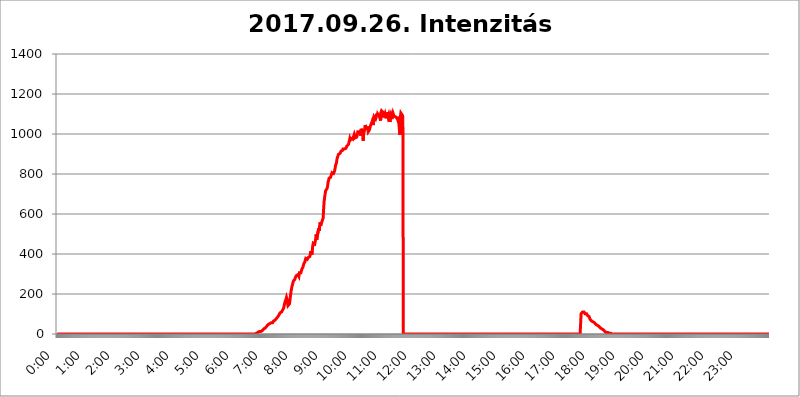
| Category | 2017.09.26. Intenzitás [W/m^2] |
|---|---|
| 0.0 | 0 |
| 0.0006944444444444445 | 0 |
| 0.001388888888888889 | 0 |
| 0.0020833333333333333 | 0 |
| 0.002777777777777778 | 0 |
| 0.003472222222222222 | 0 |
| 0.004166666666666667 | 0 |
| 0.004861111111111111 | 0 |
| 0.005555555555555556 | 0 |
| 0.0062499999999999995 | 0 |
| 0.006944444444444444 | 0 |
| 0.007638888888888889 | 0 |
| 0.008333333333333333 | 0 |
| 0.009027777777777779 | 0 |
| 0.009722222222222222 | 0 |
| 0.010416666666666666 | 0 |
| 0.011111111111111112 | 0 |
| 0.011805555555555555 | 0 |
| 0.012499999999999999 | 0 |
| 0.013194444444444444 | 0 |
| 0.013888888888888888 | 0 |
| 0.014583333333333332 | 0 |
| 0.015277777777777777 | 0 |
| 0.015972222222222224 | 0 |
| 0.016666666666666666 | 0 |
| 0.017361111111111112 | 0 |
| 0.018055555555555557 | 0 |
| 0.01875 | 0 |
| 0.019444444444444445 | 0 |
| 0.02013888888888889 | 0 |
| 0.020833333333333332 | 0 |
| 0.02152777777777778 | 0 |
| 0.022222222222222223 | 0 |
| 0.02291666666666667 | 0 |
| 0.02361111111111111 | 0 |
| 0.024305555555555556 | 0 |
| 0.024999999999999998 | 0 |
| 0.025694444444444447 | 0 |
| 0.02638888888888889 | 0 |
| 0.027083333333333334 | 0 |
| 0.027777777777777776 | 0 |
| 0.02847222222222222 | 0 |
| 0.029166666666666664 | 0 |
| 0.029861111111111113 | 0 |
| 0.030555555555555555 | 0 |
| 0.03125 | 0 |
| 0.03194444444444445 | 0 |
| 0.03263888888888889 | 0 |
| 0.03333333333333333 | 0 |
| 0.034027777777777775 | 0 |
| 0.034722222222222224 | 0 |
| 0.035416666666666666 | 0 |
| 0.036111111111111115 | 0 |
| 0.03680555555555556 | 0 |
| 0.0375 | 0 |
| 0.03819444444444444 | 0 |
| 0.03888888888888889 | 0 |
| 0.03958333333333333 | 0 |
| 0.04027777777777778 | 0 |
| 0.04097222222222222 | 0 |
| 0.041666666666666664 | 0 |
| 0.042361111111111106 | 0 |
| 0.04305555555555556 | 0 |
| 0.043750000000000004 | 0 |
| 0.044444444444444446 | 0 |
| 0.04513888888888889 | 0 |
| 0.04583333333333334 | 0 |
| 0.04652777777777778 | 0 |
| 0.04722222222222222 | 0 |
| 0.04791666666666666 | 0 |
| 0.04861111111111111 | 0 |
| 0.049305555555555554 | 0 |
| 0.049999999999999996 | 0 |
| 0.05069444444444445 | 0 |
| 0.051388888888888894 | 0 |
| 0.052083333333333336 | 0 |
| 0.05277777777777778 | 0 |
| 0.05347222222222222 | 0 |
| 0.05416666666666667 | 0 |
| 0.05486111111111111 | 0 |
| 0.05555555555555555 | 0 |
| 0.05625 | 0 |
| 0.05694444444444444 | 0 |
| 0.057638888888888885 | 0 |
| 0.05833333333333333 | 0 |
| 0.05902777777777778 | 0 |
| 0.059722222222222225 | 0 |
| 0.06041666666666667 | 0 |
| 0.061111111111111116 | 0 |
| 0.06180555555555556 | 0 |
| 0.0625 | 0 |
| 0.06319444444444444 | 0 |
| 0.06388888888888888 | 0 |
| 0.06458333333333334 | 0 |
| 0.06527777777777778 | 0 |
| 0.06597222222222222 | 0 |
| 0.06666666666666667 | 0 |
| 0.06736111111111111 | 0 |
| 0.06805555555555555 | 0 |
| 0.06874999999999999 | 0 |
| 0.06944444444444443 | 0 |
| 0.07013888888888889 | 0 |
| 0.07083333333333333 | 0 |
| 0.07152777777777779 | 0 |
| 0.07222222222222223 | 0 |
| 0.07291666666666667 | 0 |
| 0.07361111111111111 | 0 |
| 0.07430555555555556 | 0 |
| 0.075 | 0 |
| 0.07569444444444444 | 0 |
| 0.0763888888888889 | 0 |
| 0.07708333333333334 | 0 |
| 0.07777777777777778 | 0 |
| 0.07847222222222222 | 0 |
| 0.07916666666666666 | 0 |
| 0.0798611111111111 | 0 |
| 0.08055555555555556 | 0 |
| 0.08125 | 0 |
| 0.08194444444444444 | 0 |
| 0.08263888888888889 | 0 |
| 0.08333333333333333 | 0 |
| 0.08402777777777777 | 0 |
| 0.08472222222222221 | 0 |
| 0.08541666666666665 | 0 |
| 0.08611111111111112 | 0 |
| 0.08680555555555557 | 0 |
| 0.08750000000000001 | 0 |
| 0.08819444444444445 | 0 |
| 0.08888888888888889 | 0 |
| 0.08958333333333333 | 0 |
| 0.09027777777777778 | 0 |
| 0.09097222222222222 | 0 |
| 0.09166666666666667 | 0 |
| 0.09236111111111112 | 0 |
| 0.09305555555555556 | 0 |
| 0.09375 | 0 |
| 0.09444444444444444 | 0 |
| 0.09513888888888888 | 0 |
| 0.09583333333333333 | 0 |
| 0.09652777777777777 | 0 |
| 0.09722222222222222 | 0 |
| 0.09791666666666667 | 0 |
| 0.09861111111111111 | 0 |
| 0.09930555555555555 | 0 |
| 0.09999999999999999 | 0 |
| 0.10069444444444443 | 0 |
| 0.1013888888888889 | 0 |
| 0.10208333333333335 | 0 |
| 0.10277777777777779 | 0 |
| 0.10347222222222223 | 0 |
| 0.10416666666666667 | 0 |
| 0.10486111111111111 | 0 |
| 0.10555555555555556 | 0 |
| 0.10625 | 0 |
| 0.10694444444444444 | 0 |
| 0.1076388888888889 | 0 |
| 0.10833333333333334 | 0 |
| 0.10902777777777778 | 0 |
| 0.10972222222222222 | 0 |
| 0.1111111111111111 | 0 |
| 0.11180555555555556 | 0 |
| 0.11180555555555556 | 0 |
| 0.1125 | 0 |
| 0.11319444444444444 | 0 |
| 0.11388888888888889 | 0 |
| 0.11458333333333333 | 0 |
| 0.11527777777777777 | 0 |
| 0.11597222222222221 | 0 |
| 0.11666666666666665 | 0 |
| 0.1173611111111111 | 0 |
| 0.11805555555555557 | 0 |
| 0.11944444444444445 | 0 |
| 0.12013888888888889 | 0 |
| 0.12083333333333333 | 0 |
| 0.12152777777777778 | 0 |
| 0.12222222222222223 | 0 |
| 0.12291666666666667 | 0 |
| 0.12291666666666667 | 0 |
| 0.12361111111111112 | 0 |
| 0.12430555555555556 | 0 |
| 0.125 | 0 |
| 0.12569444444444444 | 0 |
| 0.12638888888888888 | 0 |
| 0.12708333333333333 | 0 |
| 0.16875 | 0 |
| 0.12847222222222224 | 0 |
| 0.12916666666666668 | 0 |
| 0.12986111111111112 | 0 |
| 0.13055555555555556 | 0 |
| 0.13125 | 0 |
| 0.13194444444444445 | 0 |
| 0.1326388888888889 | 0 |
| 0.13333333333333333 | 0 |
| 0.13402777777777777 | 0 |
| 0.13402777777777777 | 0 |
| 0.13472222222222222 | 0 |
| 0.13541666666666666 | 0 |
| 0.1361111111111111 | 0 |
| 0.13749999999999998 | 0 |
| 0.13819444444444443 | 0 |
| 0.1388888888888889 | 0 |
| 0.13958333333333334 | 0 |
| 0.14027777777777778 | 0 |
| 0.14097222222222222 | 0 |
| 0.14166666666666666 | 0 |
| 0.1423611111111111 | 0 |
| 0.14305555555555557 | 0 |
| 0.14375000000000002 | 0 |
| 0.14444444444444446 | 0 |
| 0.1451388888888889 | 0 |
| 0.1451388888888889 | 0 |
| 0.14652777777777778 | 0 |
| 0.14722222222222223 | 0 |
| 0.14791666666666667 | 0 |
| 0.1486111111111111 | 0 |
| 0.14930555555555555 | 0 |
| 0.15 | 0 |
| 0.15069444444444444 | 0 |
| 0.15138888888888888 | 0 |
| 0.15208333333333332 | 0 |
| 0.15277777777777776 | 0 |
| 0.15347222222222223 | 0 |
| 0.15416666666666667 | 0 |
| 0.15486111111111112 | 0 |
| 0.15555555555555556 | 0 |
| 0.15625 | 0 |
| 0.15694444444444444 | 0 |
| 0.15763888888888888 | 0 |
| 0.15833333333333333 | 0 |
| 0.15902777777777777 | 0 |
| 0.15972222222222224 | 0 |
| 0.16041666666666668 | 0 |
| 0.16111111111111112 | 0 |
| 0.16180555555555556 | 0 |
| 0.1625 | 0 |
| 0.16319444444444445 | 0 |
| 0.1638888888888889 | 0 |
| 0.16458333333333333 | 0 |
| 0.16527777777777777 | 0 |
| 0.16597222222222222 | 0 |
| 0.16666666666666666 | 0 |
| 0.1673611111111111 | 0 |
| 0.16805555555555554 | 0 |
| 0.16874999999999998 | 0 |
| 0.16944444444444443 | 0 |
| 0.17013888888888887 | 0 |
| 0.1708333333333333 | 0 |
| 0.17152777777777775 | 0 |
| 0.17222222222222225 | 0 |
| 0.1729166666666667 | 0 |
| 0.17361111111111113 | 0 |
| 0.17430555555555557 | 0 |
| 0.17500000000000002 | 0 |
| 0.17569444444444446 | 0 |
| 0.1763888888888889 | 0 |
| 0.17708333333333334 | 0 |
| 0.17777777777777778 | 0 |
| 0.17847222222222223 | 0 |
| 0.17916666666666667 | 0 |
| 0.1798611111111111 | 0 |
| 0.18055555555555555 | 0 |
| 0.18125 | 0 |
| 0.18194444444444444 | 0 |
| 0.1826388888888889 | 0 |
| 0.18333333333333335 | 0 |
| 0.1840277777777778 | 0 |
| 0.18472222222222223 | 0 |
| 0.18541666666666667 | 0 |
| 0.18611111111111112 | 0 |
| 0.18680555555555556 | 0 |
| 0.1875 | 0 |
| 0.18819444444444444 | 0 |
| 0.18888888888888888 | 0 |
| 0.18958333333333333 | 0 |
| 0.19027777777777777 | 0 |
| 0.1909722222222222 | 0 |
| 0.19166666666666665 | 0 |
| 0.19236111111111112 | 0 |
| 0.19305555555555554 | 0 |
| 0.19375 | 0 |
| 0.19444444444444445 | 0 |
| 0.1951388888888889 | 0 |
| 0.19583333333333333 | 0 |
| 0.19652777777777777 | 0 |
| 0.19722222222222222 | 0 |
| 0.19791666666666666 | 0 |
| 0.1986111111111111 | 0 |
| 0.19930555555555554 | 0 |
| 0.19999999999999998 | 0 |
| 0.20069444444444443 | 0 |
| 0.20138888888888887 | 0 |
| 0.2020833333333333 | 0 |
| 0.2027777777777778 | 0 |
| 0.2034722222222222 | 0 |
| 0.2041666666666667 | 0 |
| 0.20486111111111113 | 0 |
| 0.20555555555555557 | 0 |
| 0.20625000000000002 | 0 |
| 0.20694444444444446 | 0 |
| 0.2076388888888889 | 0 |
| 0.20833333333333334 | 0 |
| 0.20902777777777778 | 0 |
| 0.20972222222222223 | 0 |
| 0.21041666666666667 | 0 |
| 0.2111111111111111 | 0 |
| 0.21180555555555555 | 0 |
| 0.2125 | 0 |
| 0.21319444444444444 | 0 |
| 0.2138888888888889 | 0 |
| 0.21458333333333335 | 0 |
| 0.2152777777777778 | 0 |
| 0.21597222222222223 | 0 |
| 0.21666666666666667 | 0 |
| 0.21736111111111112 | 0 |
| 0.21805555555555556 | 0 |
| 0.21875 | 0 |
| 0.21944444444444444 | 0 |
| 0.22013888888888888 | 0 |
| 0.22083333333333333 | 0 |
| 0.22152777777777777 | 0 |
| 0.2222222222222222 | 0 |
| 0.22291666666666665 | 0 |
| 0.2236111111111111 | 0 |
| 0.22430555555555556 | 0 |
| 0.225 | 0 |
| 0.22569444444444445 | 0 |
| 0.2263888888888889 | 0 |
| 0.22708333333333333 | 0 |
| 0.22777777777777777 | 0 |
| 0.22847222222222222 | 0 |
| 0.22916666666666666 | 0 |
| 0.2298611111111111 | 0 |
| 0.23055555555555554 | 0 |
| 0.23124999999999998 | 0 |
| 0.23194444444444443 | 0 |
| 0.23263888888888887 | 0 |
| 0.2333333333333333 | 0 |
| 0.2340277777777778 | 0 |
| 0.2347222222222222 | 0 |
| 0.2354166666666667 | 0 |
| 0.23611111111111113 | 0 |
| 0.23680555555555557 | 0 |
| 0.23750000000000002 | 0 |
| 0.23819444444444446 | 0 |
| 0.2388888888888889 | 0 |
| 0.23958333333333334 | 0 |
| 0.24027777777777778 | 0 |
| 0.24097222222222223 | 0 |
| 0.24166666666666667 | 0 |
| 0.2423611111111111 | 0 |
| 0.24305555555555555 | 0 |
| 0.24375 | 0 |
| 0.24444444444444446 | 0 |
| 0.24513888888888888 | 0 |
| 0.24583333333333335 | 0 |
| 0.2465277777777778 | 0 |
| 0.24722222222222223 | 0 |
| 0.24791666666666667 | 0 |
| 0.24861111111111112 | 0 |
| 0.24930555555555556 | 0 |
| 0.25 | 0 |
| 0.25069444444444444 | 0 |
| 0.2513888888888889 | 0 |
| 0.2520833333333333 | 0 |
| 0.25277777777777777 | 0 |
| 0.2534722222222222 | 0 |
| 0.25416666666666665 | 0 |
| 0.2548611111111111 | 0 |
| 0.2555555555555556 | 0 |
| 0.25625000000000003 | 0 |
| 0.2569444444444445 | 0 |
| 0.2576388888888889 | 0 |
| 0.25833333333333336 | 0 |
| 0.2590277777777778 | 0 |
| 0.25972222222222224 | 0 |
| 0.2604166666666667 | 0 |
| 0.2611111111111111 | 0 |
| 0.26180555555555557 | 0 |
| 0.2625 | 0 |
| 0.26319444444444445 | 0 |
| 0.2638888888888889 | 0 |
| 0.26458333333333334 | 0 |
| 0.2652777777777778 | 0 |
| 0.2659722222222222 | 0 |
| 0.26666666666666666 | 0 |
| 0.2673611111111111 | 0 |
| 0.26805555555555555 | 0 |
| 0.26875 | 0 |
| 0.26944444444444443 | 0 |
| 0.2701388888888889 | 0 |
| 0.2708333333333333 | 0 |
| 0.27152777777777776 | 0 |
| 0.2722222222222222 | 0 |
| 0.27291666666666664 | 0 |
| 0.2736111111111111 | 0 |
| 0.2743055555555555 | 0 |
| 0.27499999999999997 | 0 |
| 0.27569444444444446 | 3.525 |
| 0.27638888888888885 | 0 |
| 0.27708333333333335 | 0 |
| 0.2777777777777778 | 3.525 |
| 0.27847222222222223 | 3.525 |
| 0.2791666666666667 | 3.525 |
| 0.2798611111111111 | 3.525 |
| 0.28055555555555556 | 7.887 |
| 0.28125 | 7.887 |
| 0.28194444444444444 | 7.887 |
| 0.2826388888888889 | 7.887 |
| 0.2833333333333333 | 12.257 |
| 0.28402777777777777 | 12.257 |
| 0.2847222222222222 | 12.257 |
| 0.28541666666666665 | 12.257 |
| 0.28611111111111115 | 16.636 |
| 0.28680555555555554 | 16.636 |
| 0.28750000000000003 | 16.636 |
| 0.2881944444444445 | 21.024 |
| 0.2888888888888889 | 21.024 |
| 0.28958333333333336 | 25.419 |
| 0.2902777777777778 | 25.419 |
| 0.29097222222222224 | 29.823 |
| 0.2916666666666667 | 29.823 |
| 0.2923611111111111 | 34.234 |
| 0.29305555555555557 | 34.234 |
| 0.29375 | 38.653 |
| 0.29444444444444445 | 38.653 |
| 0.2951388888888889 | 43.079 |
| 0.29583333333333334 | 47.511 |
| 0.2965277777777778 | 47.511 |
| 0.2972222222222222 | 51.951 |
| 0.29791666666666666 | 51.951 |
| 0.2986111111111111 | 51.951 |
| 0.29930555555555555 | 51.951 |
| 0.3 | 56.398 |
| 0.30069444444444443 | 56.398 |
| 0.3013888888888889 | 56.398 |
| 0.3020833333333333 | 56.398 |
| 0.30277777777777776 | 60.85 |
| 0.3034722222222222 | 65.31 |
| 0.30416666666666664 | 65.31 |
| 0.3048611111111111 | 65.31 |
| 0.3055555555555555 | 69.775 |
| 0.30624999999999997 | 74.246 |
| 0.3069444444444444 | 74.246 |
| 0.3076388888888889 | 78.722 |
| 0.30833333333333335 | 83.205 |
| 0.3090277777777778 | 83.205 |
| 0.30972222222222223 | 87.692 |
| 0.3104166666666667 | 92.184 |
| 0.3111111111111111 | 96.682 |
| 0.31180555555555556 | 101.184 |
| 0.3125 | 105.69 |
| 0.31319444444444444 | 105.69 |
| 0.3138888888888889 | 110.201 |
| 0.3145833333333333 | 110.201 |
| 0.31527777777777777 | 114.716 |
| 0.3159722222222222 | 119.235 |
| 0.31666666666666665 | 123.758 |
| 0.31736111111111115 | 128.284 |
| 0.31805555555555554 | 137.347 |
| 0.31875000000000003 | 150.964 |
| 0.3194444444444445 | 160.056 |
| 0.3201388888888889 | 164.605 |
| 0.32083333333333336 | 173.709 |
| 0.3215277777777778 | 182.82 |
| 0.32222222222222224 | 173.709 |
| 0.3229166666666667 | 155.509 |
| 0.3236111111111111 | 141.884 |
| 0.32430555555555557 | 137.347 |
| 0.325 | 141.884 |
| 0.32569444444444445 | 150.964 |
| 0.3263888888888889 | 169.156 |
| 0.32708333333333334 | 191.937 |
| 0.3277777777777778 | 210.182 |
| 0.3284722222222222 | 223.873 |
| 0.32916666666666666 | 237.564 |
| 0.3298611111111111 | 246.689 |
| 0.33055555555555555 | 255.813 |
| 0.33125 | 264.932 |
| 0.33194444444444443 | 260.373 |
| 0.3326388888888889 | 269.49 |
| 0.3333333333333333 | 274.047 |
| 0.3340277777777778 | 283.156 |
| 0.3347222222222222 | 287.709 |
| 0.3354166666666667 | 292.259 |
| 0.3361111111111111 | 292.259 |
| 0.3368055555555556 | 296.808 |
| 0.33749999999999997 | 296.808 |
| 0.33819444444444446 | 296.808 |
| 0.33888888888888885 | 287.709 |
| 0.33958333333333335 | 305.898 |
| 0.34027777777777773 | 305.898 |
| 0.34097222222222223 | 310.44 |
| 0.3416666666666666 | 305.898 |
| 0.3423611111111111 | 314.98 |
| 0.3430555555555555 | 324.052 |
| 0.34375 | 328.584 |
| 0.3444444444444445 | 333.113 |
| 0.3451388888888889 | 342.162 |
| 0.3458333333333334 | 351.198 |
| 0.34652777777777777 | 355.712 |
| 0.34722222222222227 | 360.221 |
| 0.34791666666666665 | 364.728 |
| 0.34861111111111115 | 378.224 |
| 0.34930555555555554 | 382.715 |
| 0.35000000000000003 | 378.224 |
| 0.3506944444444444 | 373.729 |
| 0.3513888888888889 | 373.729 |
| 0.3520833333333333 | 382.715 |
| 0.3527777777777778 | 378.224 |
| 0.3534722222222222 | 382.715 |
| 0.3541666666666667 | 387.202 |
| 0.3548611111111111 | 396.164 |
| 0.35555555555555557 | 414.035 |
| 0.35625 | 405.108 |
| 0.35694444444444445 | 396.164 |
| 0.3576388888888889 | 414.035 |
| 0.35833333333333334 | 440.702 |
| 0.3590277777777778 | 453.968 |
| 0.3597222222222222 | 458.38 |
| 0.36041666666666666 | 453.968 |
| 0.3611111111111111 | 449.551 |
| 0.36180555555555555 | 453.968 |
| 0.3625 | 475.972 |
| 0.36319444444444443 | 497.836 |
| 0.3638888888888889 | 471.582 |
| 0.3645833333333333 | 467.187 |
| 0.3652777777777778 | 475.972 |
| 0.3659722222222222 | 515.223 |
| 0.3666666666666667 | 528.2 |
| 0.3673611111111111 | 515.223 |
| 0.3680555555555556 | 541.121 |
| 0.36874999999999997 | 558.261 |
| 0.36944444444444446 | 541.121 |
| 0.37013888888888885 | 549.704 |
| 0.37083333333333335 | 558.261 |
| 0.37152777777777773 | 558.261 |
| 0.37222222222222223 | 558.261 |
| 0.3729166666666666 | 579.542 |
| 0.3736111111111111 | 625.784 |
| 0.3743055555555555 | 663.019 |
| 0.375 | 683.473 |
| 0.3756944444444445 | 699.717 |
| 0.3763888888888889 | 715.858 |
| 0.3770833333333334 | 711.832 |
| 0.37777777777777777 | 719.877 |
| 0.37847222222222227 | 727.896 |
| 0.37916666666666665 | 739.877 |
| 0.37986111111111115 | 759.723 |
| 0.38055555555555554 | 767.62 |
| 0.38125000000000003 | 779.42 |
| 0.3819444444444444 | 783.342 |
| 0.3826388888888889 | 783.342 |
| 0.3833333333333333 | 783.342 |
| 0.3840277777777778 | 791.169 |
| 0.3847222222222222 | 795.074 |
| 0.3854166666666667 | 806.757 |
| 0.3861111111111111 | 810.641 |
| 0.38680555555555557 | 806.757 |
| 0.3875 | 802.868 |
| 0.38819444444444445 | 802.868 |
| 0.3888888888888889 | 814.519 |
| 0.38958333333333334 | 826.123 |
| 0.3902777777777778 | 841.526 |
| 0.3909722222222222 | 845.365 |
| 0.39166666666666666 | 856.855 |
| 0.3923611111111111 | 875.918 |
| 0.39305555555555555 | 883.516 |
| 0.39375 | 887.309 |
| 0.39444444444444443 | 898.668 |
| 0.3951388888888889 | 902.447 |
| 0.3958333333333333 | 898.668 |
| 0.3965277777777778 | 902.447 |
| 0.3972222222222222 | 906.223 |
| 0.3979166666666667 | 913.766 |
| 0.3986111111111111 | 917.534 |
| 0.3993055555555556 | 917.534 |
| 0.39999999999999997 | 917.534 |
| 0.40069444444444446 | 925.06 |
| 0.40138888888888885 | 925.06 |
| 0.40208333333333335 | 925.06 |
| 0.40277777777777773 | 925.06 |
| 0.40347222222222223 | 921.298 |
| 0.4041666666666666 | 925.06 |
| 0.4048611111111111 | 928.819 |
| 0.4055555555555555 | 928.819 |
| 0.40625 | 940.082 |
| 0.4069444444444445 | 936.33 |
| 0.4076388888888889 | 943.832 |
| 0.4083333333333334 | 947.58 |
| 0.40902777777777777 | 951.327 |
| 0.40972222222222227 | 966.295 |
| 0.41041666666666665 | 977.508 |
| 0.41111111111111115 | 970.034 |
| 0.41180555555555554 | 970.034 |
| 0.41250000000000003 | 977.508 |
| 0.4131944444444444 | 977.508 |
| 0.4138888888888889 | 977.508 |
| 0.4145833333333333 | 973.772 |
| 0.4152777777777778 | 984.98 |
| 0.4159722222222222 | 988.714 |
| 0.4166666666666667 | 999.916 |
| 0.4173611111111111 | 992.448 |
| 0.41805555555555557 | 981.244 |
| 0.41875 | 977.508 |
| 0.41944444444444445 | 977.508 |
| 0.4201388888888889 | 984.98 |
| 0.42083333333333334 | 996.182 |
| 0.4215277777777778 | 1011.118 |
| 0.4222222222222222 | 1014.852 |
| 0.42291666666666666 | 1007.383 |
| 0.4236111111111111 | 1011.118 |
| 0.42430555555555555 | 999.916 |
| 0.425 | 1011.118 |
| 0.42569444444444443 | 992.448 |
| 0.4263888888888889 | 1026.06 |
| 0.4270833333333333 | 1018.587 |
| 0.4277777777777778 | 1003.65 |
| 0.4284722222222222 | 996.182 |
| 0.4291666666666667 | 966.295 |
| 0.4298611111111111 | 1022.323 |
| 0.4305555555555556 | 1014.852 |
| 0.43124999999999997 | 1026.06 |
| 0.43194444444444446 | 1044.762 |
| 0.43263888888888885 | 1037.277 |
| 0.43333333333333335 | 1037.277 |
| 0.43402777777777773 | 1022.323 |
| 0.43472222222222223 | 1037.277 |
| 0.4354166666666666 | 1026.06 |
| 0.4361111111111111 | 1011.118 |
| 0.4368055555555555 | 1011.118 |
| 0.4375 | 1018.587 |
| 0.4381944444444445 | 1026.06 |
| 0.4388888888888889 | 1029.798 |
| 0.4395833333333334 | 1044.762 |
| 0.44027777777777777 | 1041.019 |
| 0.44097222222222227 | 1056.004 |
| 0.44166666666666665 | 1063.51 |
| 0.44236111111111115 | 1052.255 |
| 0.44305555555555554 | 1044.762 |
| 0.44375000000000003 | 1067.267 |
| 0.4444444444444444 | 1086.097 |
| 0.4451388888888889 | 1089.873 |
| 0.4458333333333333 | 1089.873 |
| 0.4465277777777778 | 1074.789 |
| 0.4472222222222222 | 1082.324 |
| 0.4479166666666667 | 1101.226 |
| 0.4486111111111111 | 1089.873 |
| 0.44930555555555557 | 1101.226 |
| 0.45 | 1097.437 |
| 0.45069444444444445 | 1101.226 |
| 0.4513888888888889 | 1089.873 |
| 0.45208333333333334 | 1097.437 |
| 0.4527777777777778 | 1101.226 |
| 0.4534722222222222 | 1067.267 |
| 0.45416666666666666 | 1108.816 |
| 0.4548611111111111 | 1116.426 |
| 0.45555555555555555 | 1112.618 |
| 0.45625 | 1112.618 |
| 0.45694444444444443 | 1108.816 |
| 0.4576388888888889 | 1108.816 |
| 0.4583333333333333 | 1082.324 |
| 0.4590277777777778 | 1093.653 |
| 0.4597222222222222 | 1101.226 |
| 0.4604166666666667 | 1097.437 |
| 0.4611111111111111 | 1078.555 |
| 0.4618055555555556 | 1097.437 |
| 0.46249999999999997 | 1108.816 |
| 0.46319444444444446 | 1108.816 |
| 0.46388888888888885 | 1086.097 |
| 0.46458333333333335 | 1093.653 |
| 0.46527777777777773 | 1101.226 |
| 0.46597222222222223 | 1093.653 |
| 0.4666666666666666 | 1059.756 |
| 0.4673611111111111 | 1093.653 |
| 0.4680555555555555 | 1101.226 |
| 0.46875 | 1093.653 |
| 0.4694444444444445 | 1074.789 |
| 0.4701388888888889 | 1093.653 |
| 0.4708333333333334 | 1105.019 |
| 0.47152777777777777 | 1097.437 |
| 0.47222222222222227 | 1089.873 |
| 0.47291666666666665 | 1089.873 |
| 0.47361111111111115 | 1093.653 |
| 0.47430555555555554 | 1086.097 |
| 0.47500000000000003 | 1089.873 |
| 0.4756944444444444 | 1082.324 |
| 0.4763888888888889 | 1078.555 |
| 0.4770833333333333 | 1086.097 |
| 0.4777777777777778 | 1071.027 |
| 0.4784722222222222 | 1059.756 |
| 0.4791666666666667 | 1052.255 |
| 0.4798611111111111 | 1022.323 |
| 0.48055555555555557 | 996.182 |
| 0.48125 | 1086.097 |
| 0.48194444444444445 | 1105.019 |
| 0.4826388888888889 | 1101.226 |
| 0.48333333333333334 | 1101.226 |
| 0.4840277777777778 | 1093.653 |
| 0.4847222222222222 | 1086.097 |
| 0.48541666666666666 | 0 |
| 0.4861111111111111 | 0 |
| 0.48680555555555555 | 0 |
| 0.4875 | 0 |
| 0.48819444444444443 | 0 |
| 0.4888888888888889 | 0 |
| 0.4895833333333333 | 0 |
| 0.4902777777777778 | 0 |
| 0.4909722222222222 | 0 |
| 0.4916666666666667 | 0 |
| 0.4923611111111111 | 0 |
| 0.4930555555555556 | 0 |
| 0.49374999999999997 | 0 |
| 0.49444444444444446 | 0 |
| 0.49513888888888885 | 0 |
| 0.49583333333333335 | 0 |
| 0.49652777777777773 | 0 |
| 0.49722222222222223 | 0 |
| 0.4979166666666666 | 0 |
| 0.4986111111111111 | 0 |
| 0.4993055555555555 | 0 |
| 0.5 | 0 |
| 0.5006944444444444 | 0 |
| 0.5013888888888889 | 0 |
| 0.5020833333333333 | 0 |
| 0.5027777777777778 | 0 |
| 0.5034722222222222 | 0 |
| 0.5041666666666667 | 0 |
| 0.5048611111111111 | 0 |
| 0.5055555555555555 | 0 |
| 0.50625 | 0 |
| 0.5069444444444444 | 0 |
| 0.5076388888888889 | 0 |
| 0.5083333333333333 | 0 |
| 0.5090277777777777 | 0 |
| 0.5097222222222222 | 0 |
| 0.5104166666666666 | 0 |
| 0.5111111111111112 | 0 |
| 0.5118055555555555 | 0 |
| 0.5125000000000001 | 0 |
| 0.5131944444444444 | 0 |
| 0.513888888888889 | 0 |
| 0.5145833333333333 | 0 |
| 0.5152777777777778 | 0 |
| 0.5159722222222222 | 0 |
| 0.5166666666666667 | 0 |
| 0.517361111111111 | 0 |
| 0.5180555555555556 | 0 |
| 0.5187499999999999 | 0 |
| 0.5194444444444445 | 0 |
| 0.5201388888888888 | 0 |
| 0.5208333333333334 | 0 |
| 0.5215277777777778 | 0 |
| 0.5222222222222223 | 0 |
| 0.5229166666666667 | 0 |
| 0.5236111111111111 | 0 |
| 0.5243055555555556 | 0 |
| 0.525 | 0 |
| 0.5256944444444445 | 0 |
| 0.5263888888888889 | 0 |
| 0.5270833333333333 | 0 |
| 0.5277777777777778 | 0 |
| 0.5284722222222222 | 0 |
| 0.5291666666666667 | 0 |
| 0.5298611111111111 | 0 |
| 0.5305555555555556 | 0 |
| 0.53125 | 0 |
| 0.5319444444444444 | 0 |
| 0.5326388888888889 | 0 |
| 0.5333333333333333 | 0 |
| 0.5340277777777778 | 0 |
| 0.5347222222222222 | 0 |
| 0.5354166666666667 | 0 |
| 0.5361111111111111 | 0 |
| 0.5368055555555555 | 0 |
| 0.5375 | 0 |
| 0.5381944444444444 | 0 |
| 0.5388888888888889 | 0 |
| 0.5395833333333333 | 0 |
| 0.5402777777777777 | 0 |
| 0.5409722222222222 | 0 |
| 0.5416666666666666 | 0 |
| 0.5423611111111112 | 0 |
| 0.5430555555555555 | 0 |
| 0.5437500000000001 | 0 |
| 0.5444444444444444 | 0 |
| 0.545138888888889 | 0 |
| 0.5458333333333333 | 0 |
| 0.5465277777777778 | 0 |
| 0.5472222222222222 | 0 |
| 0.5479166666666667 | 0 |
| 0.548611111111111 | 0 |
| 0.5493055555555556 | 0 |
| 0.5499999999999999 | 0 |
| 0.5506944444444445 | 0 |
| 0.5513888888888888 | 0 |
| 0.5520833333333334 | 0 |
| 0.5527777777777778 | 0 |
| 0.5534722222222223 | 0 |
| 0.5541666666666667 | 0 |
| 0.5548611111111111 | 0 |
| 0.5555555555555556 | 0 |
| 0.55625 | 0 |
| 0.5569444444444445 | 0 |
| 0.5576388888888889 | 0 |
| 0.5583333333333333 | 0 |
| 0.5590277777777778 | 0 |
| 0.5597222222222222 | 0 |
| 0.5604166666666667 | 0 |
| 0.5611111111111111 | 0 |
| 0.5618055555555556 | 0 |
| 0.5625 | 0 |
| 0.5631944444444444 | 0 |
| 0.5638888888888889 | 0 |
| 0.5645833333333333 | 0 |
| 0.5652777777777778 | 0 |
| 0.5659722222222222 | 0 |
| 0.5666666666666667 | 0 |
| 0.5673611111111111 | 0 |
| 0.5680555555555555 | 0 |
| 0.56875 | 0 |
| 0.5694444444444444 | 0 |
| 0.5701388888888889 | 0 |
| 0.5708333333333333 | 0 |
| 0.5715277777777777 | 0 |
| 0.5722222222222222 | 0 |
| 0.5729166666666666 | 0 |
| 0.5736111111111112 | 0 |
| 0.5743055555555555 | 0 |
| 0.5750000000000001 | 0 |
| 0.5756944444444444 | 0 |
| 0.576388888888889 | 0 |
| 0.5770833333333333 | 0 |
| 0.5777777777777778 | 0 |
| 0.5784722222222222 | 0 |
| 0.5791666666666667 | 0 |
| 0.579861111111111 | 0 |
| 0.5805555555555556 | 0 |
| 0.5812499999999999 | 0 |
| 0.5819444444444445 | 0 |
| 0.5826388888888888 | 0 |
| 0.5833333333333334 | 0 |
| 0.5840277777777778 | 0 |
| 0.5847222222222223 | 0 |
| 0.5854166666666667 | 0 |
| 0.5861111111111111 | 0 |
| 0.5868055555555556 | 0 |
| 0.5875 | 0 |
| 0.5881944444444445 | 0 |
| 0.5888888888888889 | 0 |
| 0.5895833333333333 | 0 |
| 0.5902777777777778 | 0 |
| 0.5909722222222222 | 0 |
| 0.5916666666666667 | 0 |
| 0.5923611111111111 | 0 |
| 0.5930555555555556 | 0 |
| 0.59375 | 0 |
| 0.5944444444444444 | 0 |
| 0.5951388888888889 | 0 |
| 0.5958333333333333 | 0 |
| 0.5965277777777778 | 0 |
| 0.5972222222222222 | 0 |
| 0.5979166666666667 | 0 |
| 0.5986111111111111 | 0 |
| 0.5993055555555555 | 0 |
| 0.6 | 0 |
| 0.6006944444444444 | 0 |
| 0.6013888888888889 | 0 |
| 0.6020833333333333 | 0 |
| 0.6027777777777777 | 0 |
| 0.6034722222222222 | 0 |
| 0.6041666666666666 | 0 |
| 0.6048611111111112 | 0 |
| 0.6055555555555555 | 0 |
| 0.6062500000000001 | 0 |
| 0.6069444444444444 | 0 |
| 0.607638888888889 | 0 |
| 0.6083333333333333 | 0 |
| 0.6090277777777778 | 0 |
| 0.6097222222222222 | 0 |
| 0.6104166666666667 | 0 |
| 0.611111111111111 | 0 |
| 0.6118055555555556 | 0 |
| 0.6124999999999999 | 0 |
| 0.6131944444444445 | 0 |
| 0.6138888888888888 | 0 |
| 0.6145833333333334 | 0 |
| 0.6152777777777778 | 0 |
| 0.6159722222222223 | 0 |
| 0.6166666666666667 | 0 |
| 0.6173611111111111 | 0 |
| 0.6180555555555556 | 0 |
| 0.61875 | 0 |
| 0.6194444444444445 | 0 |
| 0.6201388888888889 | 0 |
| 0.6208333333333333 | 0 |
| 0.6215277777777778 | 0 |
| 0.6222222222222222 | 0 |
| 0.6229166666666667 | 0 |
| 0.6236111111111111 | 0 |
| 0.6243055555555556 | 0 |
| 0.625 | 0 |
| 0.6256944444444444 | 0 |
| 0.6263888888888889 | 0 |
| 0.6270833333333333 | 0 |
| 0.6277777777777778 | 0 |
| 0.6284722222222222 | 0 |
| 0.6291666666666667 | 0 |
| 0.6298611111111111 | 0 |
| 0.6305555555555555 | 0 |
| 0.63125 | 0 |
| 0.6319444444444444 | 0 |
| 0.6326388888888889 | 0 |
| 0.6333333333333333 | 0 |
| 0.6340277777777777 | 0 |
| 0.6347222222222222 | 0 |
| 0.6354166666666666 | 0 |
| 0.6361111111111112 | 0 |
| 0.6368055555555555 | 0 |
| 0.6375000000000001 | 0 |
| 0.6381944444444444 | 0 |
| 0.638888888888889 | 0 |
| 0.6395833333333333 | 0 |
| 0.6402777777777778 | 0 |
| 0.6409722222222222 | 0 |
| 0.6416666666666667 | 0 |
| 0.642361111111111 | 0 |
| 0.6430555555555556 | 0 |
| 0.6437499999999999 | 0 |
| 0.6444444444444445 | 0 |
| 0.6451388888888888 | 0 |
| 0.6458333333333334 | 0 |
| 0.6465277777777778 | 0 |
| 0.6472222222222223 | 0 |
| 0.6479166666666667 | 0 |
| 0.6486111111111111 | 0 |
| 0.6493055555555556 | 0 |
| 0.65 | 0 |
| 0.6506944444444445 | 0 |
| 0.6513888888888889 | 0 |
| 0.6520833333333333 | 0 |
| 0.6527777777777778 | 0 |
| 0.6534722222222222 | 0 |
| 0.6541666666666667 | 0 |
| 0.6548611111111111 | 0 |
| 0.6555555555555556 | 0 |
| 0.65625 | 0 |
| 0.6569444444444444 | 0 |
| 0.6576388888888889 | 0 |
| 0.6583333333333333 | 0 |
| 0.6590277777777778 | 0 |
| 0.6597222222222222 | 0 |
| 0.6604166666666667 | 0 |
| 0.6611111111111111 | 0 |
| 0.6618055555555555 | 0 |
| 0.6625 | 0 |
| 0.6631944444444444 | 0 |
| 0.6638888888888889 | 0 |
| 0.6645833333333333 | 0 |
| 0.6652777777777777 | 0 |
| 0.6659722222222222 | 0 |
| 0.6666666666666666 | 0 |
| 0.6673611111111111 | 0 |
| 0.6680555555555556 | 0 |
| 0.6687500000000001 | 0 |
| 0.6694444444444444 | 0 |
| 0.6701388888888888 | 0 |
| 0.6708333333333334 | 0 |
| 0.6715277777777778 | 0 |
| 0.6722222222222222 | 0 |
| 0.6729166666666666 | 0 |
| 0.6736111111111112 | 0 |
| 0.6743055555555556 | 0 |
| 0.6749999999999999 | 0 |
| 0.6756944444444444 | 0 |
| 0.6763888888888889 | 0 |
| 0.6770833333333334 | 0 |
| 0.6777777777777777 | 0 |
| 0.6784722222222223 | 0 |
| 0.6791666666666667 | 0 |
| 0.6798611111111111 | 0 |
| 0.6805555555555555 | 0 |
| 0.68125 | 0 |
| 0.6819444444444445 | 0 |
| 0.6826388888888889 | 0 |
| 0.6833333333333332 | 0 |
| 0.6840277777777778 | 0 |
| 0.6847222222222222 | 0 |
| 0.6854166666666667 | 0 |
| 0.686111111111111 | 0 |
| 0.6868055555555556 | 0 |
| 0.6875 | 0 |
| 0.6881944444444444 | 0 |
| 0.688888888888889 | 0 |
| 0.6895833333333333 | 0 |
| 0.6902777777777778 | 0 |
| 0.6909722222222222 | 0 |
| 0.6916666666666668 | 0 |
| 0.6923611111111111 | 0 |
| 0.6930555555555555 | 0 |
| 0.69375 | 0 |
| 0.6944444444444445 | 0 |
| 0.6951388888888889 | 0 |
| 0.6958333333333333 | 0 |
| 0.6965277777777777 | 0 |
| 0.6972222222222223 | 0 |
| 0.6979166666666666 | 0 |
| 0.6986111111111111 | 0 |
| 0.6993055555555556 | 0 |
| 0.7000000000000001 | 0 |
| 0.7006944444444444 | 0 |
| 0.7013888888888888 | 0 |
| 0.7020833333333334 | 0 |
| 0.7027777777777778 | 0 |
| 0.7034722222222222 | 0 |
| 0.7041666666666666 | 0 |
| 0.7048611111111112 | 0 |
| 0.7055555555555556 | 0 |
| 0.7062499999999999 | 0 |
| 0.7069444444444444 | 0 |
| 0.7076388888888889 | 0 |
| 0.7083333333333334 | 0 |
| 0.7090277777777777 | 0 |
| 0.7097222222222223 | 0 |
| 0.7104166666666667 | 0 |
| 0.7111111111111111 | 0 |
| 0.7118055555555555 | 0 |
| 0.7125 | 0 |
| 0.7131944444444445 | 0 |
| 0.7138888888888889 | 0 |
| 0.7145833333333332 | 0 |
| 0.7152777777777778 | 0 |
| 0.7159722222222222 | 0 |
| 0.7166666666666667 | 0 |
| 0.717361111111111 | 0 |
| 0.7180555555555556 | 0 |
| 0.71875 | 0 |
| 0.7194444444444444 | 0 |
| 0.720138888888889 | 0 |
| 0.7208333333333333 | 0 |
| 0.7215277777777778 | 0 |
| 0.7222222222222222 | 0 |
| 0.7229166666666668 | 0 |
| 0.7236111111111111 | 0 |
| 0.7243055555555555 | 0 |
| 0.725 | 0 |
| 0.7256944444444445 | 0 |
| 0.7263888888888889 | 0 |
| 0.7270833333333333 | 0 |
| 0.7277777777777777 | 0 |
| 0.7284722222222223 | 0 |
| 0.7291666666666666 | 0 |
| 0.7298611111111111 | 0 |
| 0.7305555555555556 | 0 |
| 0.7312500000000001 | 0 |
| 0.7319444444444444 | 0 |
| 0.7326388888888888 | 0 |
| 0.7333333333333334 | 0 |
| 0.7340277777777778 | 0 |
| 0.7347222222222222 | 101.184 |
| 0.7354166666666666 | 101.184 |
| 0.7361111111111112 | 105.69 |
| 0.7368055555555556 | 110.201 |
| 0.7374999999999999 | 110.201 |
| 0.7381944444444444 | 110.201 |
| 0.7388888888888889 | 110.201 |
| 0.7395833333333334 | 105.69 |
| 0.7402777777777777 | 101.184 |
| 0.7409722222222223 | 105.69 |
| 0.7416666666666667 | 101.184 |
| 0.7423611111111111 | 101.184 |
| 0.7430555555555555 | 96.682 |
| 0.74375 | 92.184 |
| 0.7444444444444445 | 87.692 |
| 0.7451388888888889 | 87.692 |
| 0.7458333333333332 | 87.692 |
| 0.7465277777777778 | 83.205 |
| 0.7472222222222222 | 74.246 |
| 0.7479166666666667 | 74.246 |
| 0.748611111111111 | 69.775 |
| 0.7493055555555556 | 65.31 |
| 0.75 | 65.31 |
| 0.7506944444444444 | 65.31 |
| 0.751388888888889 | 60.85 |
| 0.7520833333333333 | 60.85 |
| 0.7527777777777778 | 60.85 |
| 0.7534722222222222 | 56.398 |
| 0.7541666666666668 | 56.398 |
| 0.7548611111111111 | 51.951 |
| 0.7555555555555555 | 47.511 |
| 0.75625 | 47.511 |
| 0.7569444444444445 | 43.079 |
| 0.7576388888888889 | 43.079 |
| 0.7583333333333333 | 38.653 |
| 0.7590277777777777 | 38.653 |
| 0.7597222222222223 | 38.653 |
| 0.7604166666666666 | 34.234 |
| 0.7611111111111111 | 34.234 |
| 0.7618055555555556 | 29.823 |
| 0.7625000000000001 | 29.823 |
| 0.7631944444444444 | 25.419 |
| 0.7638888888888888 | 25.419 |
| 0.7645833333333334 | 21.024 |
| 0.7652777777777778 | 21.024 |
| 0.7659722222222222 | 21.024 |
| 0.7666666666666666 | 16.636 |
| 0.7673611111111112 | 16.636 |
| 0.7680555555555556 | 12.257 |
| 0.7687499999999999 | 12.257 |
| 0.7694444444444444 | 12.257 |
| 0.7701388888888889 | 7.887 |
| 0.7708333333333334 | 7.887 |
| 0.7715277777777777 | 7.887 |
| 0.7722222222222223 | 7.887 |
| 0.7729166666666667 | 3.525 |
| 0.7736111111111111 | 3.525 |
| 0.7743055555555555 | 3.525 |
| 0.775 | 3.525 |
| 0.7756944444444445 | 3.525 |
| 0.7763888888888889 | 3.525 |
| 0.7770833333333332 | 3.525 |
| 0.7777777777777778 | 0 |
| 0.7784722222222222 | 0 |
| 0.7791666666666667 | 0 |
| 0.779861111111111 | 0 |
| 0.7805555555555556 | 0 |
| 0.78125 | 0 |
| 0.7819444444444444 | 0 |
| 0.782638888888889 | 0 |
| 0.7833333333333333 | 0 |
| 0.7840277777777778 | 0 |
| 0.7847222222222222 | 0 |
| 0.7854166666666668 | 0 |
| 0.7861111111111111 | 0 |
| 0.7868055555555555 | 0 |
| 0.7875 | 0 |
| 0.7881944444444445 | 0 |
| 0.7888888888888889 | 0 |
| 0.7895833333333333 | 0 |
| 0.7902777777777777 | 0 |
| 0.7909722222222223 | 0 |
| 0.7916666666666666 | 0 |
| 0.7923611111111111 | 0 |
| 0.7930555555555556 | 0 |
| 0.7937500000000001 | 0 |
| 0.7944444444444444 | 0 |
| 0.7951388888888888 | 0 |
| 0.7958333333333334 | 0 |
| 0.7965277777777778 | 0 |
| 0.7972222222222222 | 0 |
| 0.7979166666666666 | 0 |
| 0.7986111111111112 | 0 |
| 0.7993055555555556 | 0 |
| 0.7999999999999999 | 0 |
| 0.8006944444444444 | 0 |
| 0.8013888888888889 | 0 |
| 0.8020833333333334 | 0 |
| 0.8027777777777777 | 0 |
| 0.8034722222222223 | 0 |
| 0.8041666666666667 | 0 |
| 0.8048611111111111 | 0 |
| 0.8055555555555555 | 0 |
| 0.80625 | 0 |
| 0.8069444444444445 | 0 |
| 0.8076388888888889 | 0 |
| 0.8083333333333332 | 0 |
| 0.8090277777777778 | 0 |
| 0.8097222222222222 | 0 |
| 0.8104166666666667 | 0 |
| 0.811111111111111 | 0 |
| 0.8118055555555556 | 0 |
| 0.8125 | 0 |
| 0.8131944444444444 | 0 |
| 0.813888888888889 | 0 |
| 0.8145833333333333 | 0 |
| 0.8152777777777778 | 0 |
| 0.8159722222222222 | 0 |
| 0.8166666666666668 | 0 |
| 0.8173611111111111 | 0 |
| 0.8180555555555555 | 0 |
| 0.81875 | 0 |
| 0.8194444444444445 | 0 |
| 0.8201388888888889 | 0 |
| 0.8208333333333333 | 0 |
| 0.8215277777777777 | 0 |
| 0.8222222222222223 | 0 |
| 0.8229166666666666 | 0 |
| 0.8236111111111111 | 0 |
| 0.8243055555555556 | 0 |
| 0.8250000000000001 | 0 |
| 0.8256944444444444 | 0 |
| 0.8263888888888888 | 0 |
| 0.8270833333333334 | 0 |
| 0.8277777777777778 | 0 |
| 0.8284722222222222 | 0 |
| 0.8291666666666666 | 0 |
| 0.8298611111111112 | 0 |
| 0.8305555555555556 | 0 |
| 0.8312499999999999 | 0 |
| 0.8319444444444444 | 0 |
| 0.8326388888888889 | 0 |
| 0.8333333333333334 | 0 |
| 0.8340277777777777 | 0 |
| 0.8347222222222223 | 0 |
| 0.8354166666666667 | 0 |
| 0.8361111111111111 | 0 |
| 0.8368055555555555 | 0 |
| 0.8375 | 0 |
| 0.8381944444444445 | 0 |
| 0.8388888888888889 | 0 |
| 0.8395833333333332 | 0 |
| 0.8402777777777778 | 0 |
| 0.8409722222222222 | 0 |
| 0.8416666666666667 | 0 |
| 0.842361111111111 | 0 |
| 0.8430555555555556 | 0 |
| 0.84375 | 0 |
| 0.8444444444444444 | 0 |
| 0.845138888888889 | 0 |
| 0.8458333333333333 | 0 |
| 0.8465277777777778 | 0 |
| 0.8472222222222222 | 0 |
| 0.8479166666666668 | 0 |
| 0.8486111111111111 | 0 |
| 0.8493055555555555 | 0 |
| 0.85 | 0 |
| 0.8506944444444445 | 0 |
| 0.8513888888888889 | 0 |
| 0.8520833333333333 | 0 |
| 0.8527777777777777 | 0 |
| 0.8534722222222223 | 0 |
| 0.8541666666666666 | 0 |
| 0.8548611111111111 | 0 |
| 0.8555555555555556 | 0 |
| 0.8562500000000001 | 0 |
| 0.8569444444444444 | 0 |
| 0.8576388888888888 | 0 |
| 0.8583333333333334 | 0 |
| 0.8590277777777778 | 0 |
| 0.8597222222222222 | 0 |
| 0.8604166666666666 | 0 |
| 0.8611111111111112 | 0 |
| 0.8618055555555556 | 0 |
| 0.8624999999999999 | 0 |
| 0.8631944444444444 | 0 |
| 0.8638888888888889 | 0 |
| 0.8645833333333334 | 0 |
| 0.8652777777777777 | 0 |
| 0.8659722222222223 | 0 |
| 0.8666666666666667 | 0 |
| 0.8673611111111111 | 0 |
| 0.8680555555555555 | 0 |
| 0.86875 | 0 |
| 0.8694444444444445 | 0 |
| 0.8701388888888889 | 0 |
| 0.8708333333333332 | 0 |
| 0.8715277777777778 | 0 |
| 0.8722222222222222 | 0 |
| 0.8729166666666667 | 0 |
| 0.873611111111111 | 0 |
| 0.8743055555555556 | 0 |
| 0.875 | 0 |
| 0.8756944444444444 | 0 |
| 0.876388888888889 | 0 |
| 0.8770833333333333 | 0 |
| 0.8777777777777778 | 0 |
| 0.8784722222222222 | 0 |
| 0.8791666666666668 | 0 |
| 0.8798611111111111 | 0 |
| 0.8805555555555555 | 0 |
| 0.88125 | 0 |
| 0.8819444444444445 | 0 |
| 0.8826388888888889 | 0 |
| 0.8833333333333333 | 0 |
| 0.8840277777777777 | 0 |
| 0.8847222222222223 | 0 |
| 0.8854166666666666 | 0 |
| 0.8861111111111111 | 0 |
| 0.8868055555555556 | 0 |
| 0.8875000000000001 | 0 |
| 0.8881944444444444 | 0 |
| 0.8888888888888888 | 0 |
| 0.8895833333333334 | 0 |
| 0.8902777777777778 | 0 |
| 0.8909722222222222 | 0 |
| 0.8916666666666666 | 0 |
| 0.8923611111111112 | 0 |
| 0.8930555555555556 | 0 |
| 0.8937499999999999 | 0 |
| 0.8944444444444444 | 0 |
| 0.8951388888888889 | 0 |
| 0.8958333333333334 | 0 |
| 0.8965277777777777 | 0 |
| 0.8972222222222223 | 0 |
| 0.8979166666666667 | 0 |
| 0.8986111111111111 | 0 |
| 0.8993055555555555 | 0 |
| 0.9 | 0 |
| 0.9006944444444445 | 0 |
| 0.9013888888888889 | 0 |
| 0.9020833333333332 | 0 |
| 0.9027777777777778 | 0 |
| 0.9034722222222222 | 0 |
| 0.9041666666666667 | 0 |
| 0.904861111111111 | 0 |
| 0.9055555555555556 | 0 |
| 0.90625 | 0 |
| 0.9069444444444444 | 0 |
| 0.907638888888889 | 0 |
| 0.9083333333333333 | 0 |
| 0.9090277777777778 | 0 |
| 0.9097222222222222 | 0 |
| 0.9104166666666668 | 0 |
| 0.9111111111111111 | 0 |
| 0.9118055555555555 | 0 |
| 0.9125 | 0 |
| 0.9131944444444445 | 0 |
| 0.9138888888888889 | 0 |
| 0.9145833333333333 | 0 |
| 0.9152777777777777 | 0 |
| 0.9159722222222223 | 0 |
| 0.9166666666666666 | 0 |
| 0.9173611111111111 | 0 |
| 0.9180555555555556 | 0 |
| 0.9187500000000001 | 0 |
| 0.9194444444444444 | 0 |
| 0.9201388888888888 | 0 |
| 0.9208333333333334 | 0 |
| 0.9215277777777778 | 0 |
| 0.9222222222222222 | 0 |
| 0.9229166666666666 | 0 |
| 0.9236111111111112 | 0 |
| 0.9243055555555556 | 0 |
| 0.9249999999999999 | 0 |
| 0.9256944444444444 | 0 |
| 0.9263888888888889 | 0 |
| 0.9270833333333334 | 0 |
| 0.9277777777777777 | 0 |
| 0.9284722222222223 | 0 |
| 0.9291666666666667 | 0 |
| 0.9298611111111111 | 0 |
| 0.9305555555555555 | 0 |
| 0.93125 | 0 |
| 0.9319444444444445 | 0 |
| 0.9326388888888889 | 0 |
| 0.9333333333333332 | 0 |
| 0.9340277777777778 | 0 |
| 0.9347222222222222 | 0 |
| 0.9354166666666667 | 0 |
| 0.936111111111111 | 0 |
| 0.9368055555555556 | 0 |
| 0.9375 | 0 |
| 0.9381944444444444 | 0 |
| 0.938888888888889 | 0 |
| 0.9395833333333333 | 0 |
| 0.9402777777777778 | 0 |
| 0.9409722222222222 | 0 |
| 0.9416666666666668 | 0 |
| 0.9423611111111111 | 0 |
| 0.9430555555555555 | 0 |
| 0.94375 | 0 |
| 0.9444444444444445 | 0 |
| 0.9451388888888889 | 0 |
| 0.9458333333333333 | 0 |
| 0.9465277777777777 | 0 |
| 0.9472222222222223 | 0 |
| 0.9479166666666666 | 0 |
| 0.9486111111111111 | 0 |
| 0.9493055555555556 | 0 |
| 0.9500000000000001 | 0 |
| 0.9506944444444444 | 0 |
| 0.9513888888888888 | 0 |
| 0.9520833333333334 | 0 |
| 0.9527777777777778 | 0 |
| 0.9534722222222222 | 0 |
| 0.9541666666666666 | 0 |
| 0.9548611111111112 | 0 |
| 0.9555555555555556 | 0 |
| 0.9562499999999999 | 0 |
| 0.9569444444444444 | 0 |
| 0.9576388888888889 | 0 |
| 0.9583333333333334 | 0 |
| 0.9590277777777777 | 0 |
| 0.9597222222222223 | 0 |
| 0.9604166666666667 | 0 |
| 0.9611111111111111 | 0 |
| 0.9618055555555555 | 0 |
| 0.9625 | 0 |
| 0.9631944444444445 | 0 |
| 0.9638888888888889 | 0 |
| 0.9645833333333332 | 0 |
| 0.9652777777777778 | 0 |
| 0.9659722222222222 | 0 |
| 0.9666666666666667 | 0 |
| 0.967361111111111 | 0 |
| 0.9680555555555556 | 0 |
| 0.96875 | 0 |
| 0.9694444444444444 | 0 |
| 0.970138888888889 | 0 |
| 0.9708333333333333 | 0 |
| 0.9715277777777778 | 0 |
| 0.9722222222222222 | 0 |
| 0.9729166666666668 | 0 |
| 0.9736111111111111 | 0 |
| 0.9743055555555555 | 0 |
| 0.975 | 0 |
| 0.9756944444444445 | 0 |
| 0.9763888888888889 | 0 |
| 0.9770833333333333 | 0 |
| 0.9777777777777777 | 0 |
| 0.9784722222222223 | 0 |
| 0.9791666666666666 | 0 |
| 0.9798611111111111 | 0 |
| 0.9805555555555556 | 0 |
| 0.9812500000000001 | 0 |
| 0.9819444444444444 | 0 |
| 0.9826388888888888 | 0 |
| 0.9833333333333334 | 0 |
| 0.9840277777777778 | 0 |
| 0.9847222222222222 | 0 |
| 0.9854166666666666 | 0 |
| 0.9861111111111112 | 0 |
| 0.9868055555555556 | 0 |
| 0.9874999999999999 | 0 |
| 0.9881944444444444 | 0 |
| 0.9888888888888889 | 0 |
| 0.9895833333333334 | 0 |
| 0.9902777777777777 | 0 |
| 0.9909722222222223 | 0 |
| 0.9916666666666667 | 0 |
| 0.9923611111111111 | 0 |
| 0.9930555555555555 | 0 |
| 0.99375 | 0 |
| 0.9944444444444445 | 0 |
| 0.9951388888888889 | 0 |
| 0.9958333333333332 | 0 |
| 0.9965277777777778 | 0 |
| 0.9972222222222222 | 0 |
| 0.9979166666666667 | 0 |
| 0.998611111111111 | 0 |
| 0.9993055555555556 | 0 |